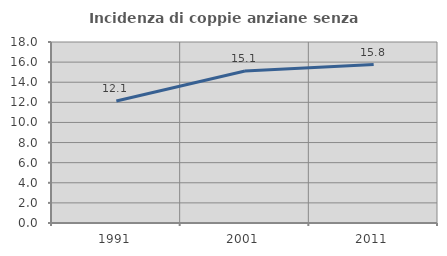
| Category | Incidenza di coppie anziane senza figli  |
|---|---|
| 1991.0 | 12.134 |
| 2001.0 | 15.116 |
| 2011.0 | 15.757 |